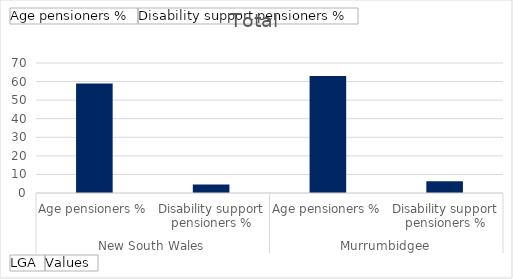
| Category | Total |
|---|---|
| 0 | 59.021 |
| 1 | 4.569 |
| 2 | 62.981 |
| 3 | 6.349 |